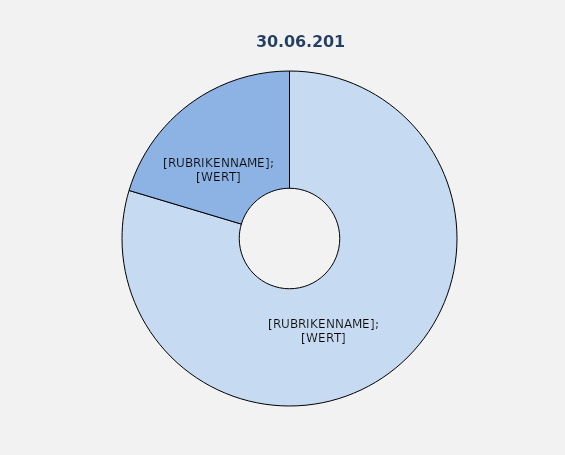
| Category | Series 1 |
|---|---|
| Vollzeitbeschäftigte | 79.08 |
| Teilzeitbeschäftigte | 20.23 |